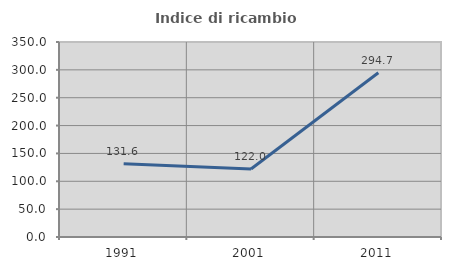
| Category | Indice di ricambio occupazionale  |
|---|---|
| 1991.0 | 131.571 |
| 2001.0 | 121.967 |
| 2011.0 | 294.712 |